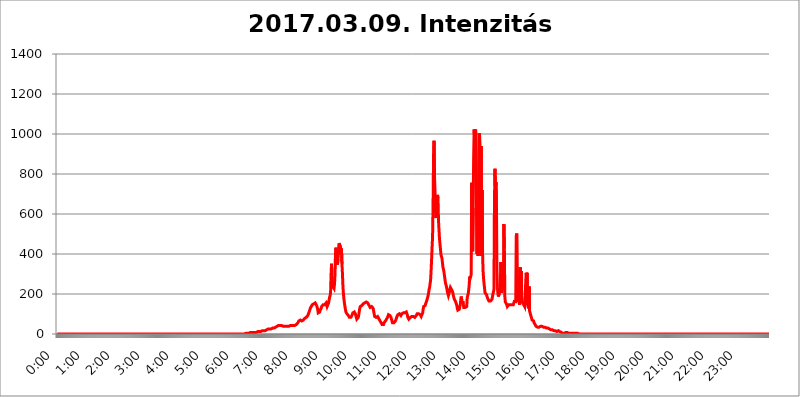
| Category | 2017.03.09. Intenzitás [W/m^2] |
|---|---|
| 0.0 | 0 |
| 0.0006944444444444445 | 0 |
| 0.001388888888888889 | 0 |
| 0.0020833333333333333 | 0 |
| 0.002777777777777778 | 0 |
| 0.003472222222222222 | 0 |
| 0.004166666666666667 | 0 |
| 0.004861111111111111 | 0 |
| 0.005555555555555556 | 0 |
| 0.0062499999999999995 | 0 |
| 0.006944444444444444 | 0 |
| 0.007638888888888889 | 0 |
| 0.008333333333333333 | 0 |
| 0.009027777777777779 | 0 |
| 0.009722222222222222 | 0 |
| 0.010416666666666666 | 0 |
| 0.011111111111111112 | 0 |
| 0.011805555555555555 | 0 |
| 0.012499999999999999 | 0 |
| 0.013194444444444444 | 0 |
| 0.013888888888888888 | 0 |
| 0.014583333333333332 | 0 |
| 0.015277777777777777 | 0 |
| 0.015972222222222224 | 0 |
| 0.016666666666666666 | 0 |
| 0.017361111111111112 | 0 |
| 0.018055555555555557 | 0 |
| 0.01875 | 0 |
| 0.019444444444444445 | 0 |
| 0.02013888888888889 | 0 |
| 0.020833333333333332 | 0 |
| 0.02152777777777778 | 0 |
| 0.022222222222222223 | 0 |
| 0.02291666666666667 | 0 |
| 0.02361111111111111 | 0 |
| 0.024305555555555556 | 0 |
| 0.024999999999999998 | 0 |
| 0.025694444444444447 | 0 |
| 0.02638888888888889 | 0 |
| 0.027083333333333334 | 0 |
| 0.027777777777777776 | 0 |
| 0.02847222222222222 | 0 |
| 0.029166666666666664 | 0 |
| 0.029861111111111113 | 0 |
| 0.030555555555555555 | 0 |
| 0.03125 | 0 |
| 0.03194444444444445 | 0 |
| 0.03263888888888889 | 0 |
| 0.03333333333333333 | 0 |
| 0.034027777777777775 | 0 |
| 0.034722222222222224 | 0 |
| 0.035416666666666666 | 0 |
| 0.036111111111111115 | 0 |
| 0.03680555555555556 | 0 |
| 0.0375 | 0 |
| 0.03819444444444444 | 0 |
| 0.03888888888888889 | 0 |
| 0.03958333333333333 | 0 |
| 0.04027777777777778 | 0 |
| 0.04097222222222222 | 0 |
| 0.041666666666666664 | 0 |
| 0.042361111111111106 | 0 |
| 0.04305555555555556 | 0 |
| 0.043750000000000004 | 0 |
| 0.044444444444444446 | 0 |
| 0.04513888888888889 | 0 |
| 0.04583333333333334 | 0 |
| 0.04652777777777778 | 0 |
| 0.04722222222222222 | 0 |
| 0.04791666666666666 | 0 |
| 0.04861111111111111 | 0 |
| 0.049305555555555554 | 0 |
| 0.049999999999999996 | 0 |
| 0.05069444444444445 | 0 |
| 0.051388888888888894 | 0 |
| 0.052083333333333336 | 0 |
| 0.05277777777777778 | 0 |
| 0.05347222222222222 | 0 |
| 0.05416666666666667 | 0 |
| 0.05486111111111111 | 0 |
| 0.05555555555555555 | 0 |
| 0.05625 | 0 |
| 0.05694444444444444 | 0 |
| 0.057638888888888885 | 0 |
| 0.05833333333333333 | 0 |
| 0.05902777777777778 | 0 |
| 0.059722222222222225 | 0 |
| 0.06041666666666667 | 0 |
| 0.061111111111111116 | 0 |
| 0.06180555555555556 | 0 |
| 0.0625 | 0 |
| 0.06319444444444444 | 0 |
| 0.06388888888888888 | 0 |
| 0.06458333333333334 | 0 |
| 0.06527777777777778 | 0 |
| 0.06597222222222222 | 0 |
| 0.06666666666666667 | 0 |
| 0.06736111111111111 | 0 |
| 0.06805555555555555 | 0 |
| 0.06874999999999999 | 0 |
| 0.06944444444444443 | 0 |
| 0.07013888888888889 | 0 |
| 0.07083333333333333 | 0 |
| 0.07152777777777779 | 0 |
| 0.07222222222222223 | 0 |
| 0.07291666666666667 | 0 |
| 0.07361111111111111 | 0 |
| 0.07430555555555556 | 0 |
| 0.075 | 0 |
| 0.07569444444444444 | 0 |
| 0.0763888888888889 | 0 |
| 0.07708333333333334 | 0 |
| 0.07777777777777778 | 0 |
| 0.07847222222222222 | 0 |
| 0.07916666666666666 | 0 |
| 0.0798611111111111 | 0 |
| 0.08055555555555556 | 0 |
| 0.08125 | 0 |
| 0.08194444444444444 | 0 |
| 0.08263888888888889 | 0 |
| 0.08333333333333333 | 0 |
| 0.08402777777777777 | 0 |
| 0.08472222222222221 | 0 |
| 0.08541666666666665 | 0 |
| 0.08611111111111112 | 0 |
| 0.08680555555555557 | 0 |
| 0.08750000000000001 | 0 |
| 0.08819444444444445 | 0 |
| 0.08888888888888889 | 0 |
| 0.08958333333333333 | 0 |
| 0.09027777777777778 | 0 |
| 0.09097222222222222 | 0 |
| 0.09166666666666667 | 0 |
| 0.09236111111111112 | 0 |
| 0.09305555555555556 | 0 |
| 0.09375 | 0 |
| 0.09444444444444444 | 0 |
| 0.09513888888888888 | 0 |
| 0.09583333333333333 | 0 |
| 0.09652777777777777 | 0 |
| 0.09722222222222222 | 0 |
| 0.09791666666666667 | 0 |
| 0.09861111111111111 | 0 |
| 0.09930555555555555 | 0 |
| 0.09999999999999999 | 0 |
| 0.10069444444444443 | 0 |
| 0.1013888888888889 | 0 |
| 0.10208333333333335 | 0 |
| 0.10277777777777779 | 0 |
| 0.10347222222222223 | 0 |
| 0.10416666666666667 | 0 |
| 0.10486111111111111 | 0 |
| 0.10555555555555556 | 0 |
| 0.10625 | 0 |
| 0.10694444444444444 | 0 |
| 0.1076388888888889 | 0 |
| 0.10833333333333334 | 0 |
| 0.10902777777777778 | 0 |
| 0.10972222222222222 | 0 |
| 0.1111111111111111 | 0 |
| 0.11180555555555556 | 0 |
| 0.11180555555555556 | 0 |
| 0.1125 | 0 |
| 0.11319444444444444 | 0 |
| 0.11388888888888889 | 0 |
| 0.11458333333333333 | 0 |
| 0.11527777777777777 | 0 |
| 0.11597222222222221 | 0 |
| 0.11666666666666665 | 0 |
| 0.1173611111111111 | 0 |
| 0.11805555555555557 | 0 |
| 0.11944444444444445 | 0 |
| 0.12013888888888889 | 0 |
| 0.12083333333333333 | 0 |
| 0.12152777777777778 | 0 |
| 0.12222222222222223 | 0 |
| 0.12291666666666667 | 0 |
| 0.12291666666666667 | 0 |
| 0.12361111111111112 | 0 |
| 0.12430555555555556 | 0 |
| 0.125 | 0 |
| 0.12569444444444444 | 0 |
| 0.12638888888888888 | 0 |
| 0.12708333333333333 | 0 |
| 0.16875 | 0 |
| 0.12847222222222224 | 0 |
| 0.12916666666666668 | 0 |
| 0.12986111111111112 | 0 |
| 0.13055555555555556 | 0 |
| 0.13125 | 0 |
| 0.13194444444444445 | 0 |
| 0.1326388888888889 | 0 |
| 0.13333333333333333 | 0 |
| 0.13402777777777777 | 0 |
| 0.13402777777777777 | 0 |
| 0.13472222222222222 | 0 |
| 0.13541666666666666 | 0 |
| 0.1361111111111111 | 0 |
| 0.13749999999999998 | 0 |
| 0.13819444444444443 | 0 |
| 0.1388888888888889 | 0 |
| 0.13958333333333334 | 0 |
| 0.14027777777777778 | 0 |
| 0.14097222222222222 | 0 |
| 0.14166666666666666 | 0 |
| 0.1423611111111111 | 0 |
| 0.14305555555555557 | 0 |
| 0.14375000000000002 | 0 |
| 0.14444444444444446 | 0 |
| 0.1451388888888889 | 0 |
| 0.1451388888888889 | 0 |
| 0.14652777777777778 | 0 |
| 0.14722222222222223 | 0 |
| 0.14791666666666667 | 0 |
| 0.1486111111111111 | 0 |
| 0.14930555555555555 | 0 |
| 0.15 | 0 |
| 0.15069444444444444 | 0 |
| 0.15138888888888888 | 0 |
| 0.15208333333333332 | 0 |
| 0.15277777777777776 | 0 |
| 0.15347222222222223 | 0 |
| 0.15416666666666667 | 0 |
| 0.15486111111111112 | 0 |
| 0.15555555555555556 | 0 |
| 0.15625 | 0 |
| 0.15694444444444444 | 0 |
| 0.15763888888888888 | 0 |
| 0.15833333333333333 | 0 |
| 0.15902777777777777 | 0 |
| 0.15972222222222224 | 0 |
| 0.16041666666666668 | 0 |
| 0.16111111111111112 | 0 |
| 0.16180555555555556 | 0 |
| 0.1625 | 0 |
| 0.16319444444444445 | 0 |
| 0.1638888888888889 | 0 |
| 0.16458333333333333 | 0 |
| 0.16527777777777777 | 0 |
| 0.16597222222222222 | 0 |
| 0.16666666666666666 | 0 |
| 0.1673611111111111 | 0 |
| 0.16805555555555554 | 0 |
| 0.16874999999999998 | 0 |
| 0.16944444444444443 | 0 |
| 0.17013888888888887 | 0 |
| 0.1708333333333333 | 0 |
| 0.17152777777777775 | 0 |
| 0.17222222222222225 | 0 |
| 0.1729166666666667 | 0 |
| 0.17361111111111113 | 0 |
| 0.17430555555555557 | 0 |
| 0.17500000000000002 | 0 |
| 0.17569444444444446 | 0 |
| 0.1763888888888889 | 0 |
| 0.17708333333333334 | 0 |
| 0.17777777777777778 | 0 |
| 0.17847222222222223 | 0 |
| 0.17916666666666667 | 0 |
| 0.1798611111111111 | 0 |
| 0.18055555555555555 | 0 |
| 0.18125 | 0 |
| 0.18194444444444444 | 0 |
| 0.1826388888888889 | 0 |
| 0.18333333333333335 | 0 |
| 0.1840277777777778 | 0 |
| 0.18472222222222223 | 0 |
| 0.18541666666666667 | 0 |
| 0.18611111111111112 | 0 |
| 0.18680555555555556 | 0 |
| 0.1875 | 0 |
| 0.18819444444444444 | 0 |
| 0.18888888888888888 | 0 |
| 0.18958333333333333 | 0 |
| 0.19027777777777777 | 0 |
| 0.1909722222222222 | 0 |
| 0.19166666666666665 | 0 |
| 0.19236111111111112 | 0 |
| 0.19305555555555554 | 0 |
| 0.19375 | 0 |
| 0.19444444444444445 | 0 |
| 0.1951388888888889 | 0 |
| 0.19583333333333333 | 0 |
| 0.19652777777777777 | 0 |
| 0.19722222222222222 | 0 |
| 0.19791666666666666 | 0 |
| 0.1986111111111111 | 0 |
| 0.19930555555555554 | 0 |
| 0.19999999999999998 | 0 |
| 0.20069444444444443 | 0 |
| 0.20138888888888887 | 0 |
| 0.2020833333333333 | 0 |
| 0.2027777777777778 | 0 |
| 0.2034722222222222 | 0 |
| 0.2041666666666667 | 0 |
| 0.20486111111111113 | 0 |
| 0.20555555555555557 | 0 |
| 0.20625000000000002 | 0 |
| 0.20694444444444446 | 0 |
| 0.2076388888888889 | 0 |
| 0.20833333333333334 | 0 |
| 0.20902777777777778 | 0 |
| 0.20972222222222223 | 0 |
| 0.21041666666666667 | 0 |
| 0.2111111111111111 | 0 |
| 0.21180555555555555 | 0 |
| 0.2125 | 0 |
| 0.21319444444444444 | 0 |
| 0.2138888888888889 | 0 |
| 0.21458333333333335 | 0 |
| 0.2152777777777778 | 0 |
| 0.21597222222222223 | 0 |
| 0.21666666666666667 | 0 |
| 0.21736111111111112 | 0 |
| 0.21805555555555556 | 0 |
| 0.21875 | 0 |
| 0.21944444444444444 | 0 |
| 0.22013888888888888 | 0 |
| 0.22083333333333333 | 0 |
| 0.22152777777777777 | 0 |
| 0.2222222222222222 | 0 |
| 0.22291666666666665 | 0 |
| 0.2236111111111111 | 0 |
| 0.22430555555555556 | 0 |
| 0.225 | 0 |
| 0.22569444444444445 | 0 |
| 0.2263888888888889 | 0 |
| 0.22708333333333333 | 0 |
| 0.22777777777777777 | 0 |
| 0.22847222222222222 | 0 |
| 0.22916666666666666 | 0 |
| 0.2298611111111111 | 0 |
| 0.23055555555555554 | 0 |
| 0.23124999999999998 | 0 |
| 0.23194444444444443 | 0 |
| 0.23263888888888887 | 0 |
| 0.2333333333333333 | 0 |
| 0.2340277777777778 | 0 |
| 0.2347222222222222 | 0 |
| 0.2354166666666667 | 0 |
| 0.23611111111111113 | 0 |
| 0.23680555555555557 | 0 |
| 0.23750000000000002 | 0 |
| 0.23819444444444446 | 0 |
| 0.2388888888888889 | 0 |
| 0.23958333333333334 | 0 |
| 0.24027777777777778 | 0 |
| 0.24097222222222223 | 0 |
| 0.24166666666666667 | 0 |
| 0.2423611111111111 | 0 |
| 0.24305555555555555 | 0 |
| 0.24375 | 0 |
| 0.24444444444444446 | 0 |
| 0.24513888888888888 | 0 |
| 0.24583333333333335 | 0 |
| 0.2465277777777778 | 0 |
| 0.24722222222222223 | 0 |
| 0.24791666666666667 | 0 |
| 0.24861111111111112 | 0 |
| 0.24930555555555556 | 0 |
| 0.25 | 0 |
| 0.25069444444444444 | 0 |
| 0.2513888888888889 | 0 |
| 0.2520833333333333 | 0 |
| 0.25277777777777777 | 0 |
| 0.2534722222222222 | 0 |
| 0.25416666666666665 | 0 |
| 0.2548611111111111 | 0 |
| 0.2555555555555556 | 0 |
| 0.25625000000000003 | 0 |
| 0.2569444444444445 | 0 |
| 0.2576388888888889 | 0 |
| 0.25833333333333336 | 0 |
| 0.2590277777777778 | 0 |
| 0.25972222222222224 | 0 |
| 0.2604166666666667 | 0 |
| 0.2611111111111111 | 0 |
| 0.26180555555555557 | 0 |
| 0.2625 | 0 |
| 0.26319444444444445 | 0 |
| 0.2638888888888889 | 0 |
| 0.26458333333333334 | 3.525 |
| 0.2652777777777778 | 3.525 |
| 0.2659722222222222 | 3.525 |
| 0.26666666666666666 | 3.525 |
| 0.2673611111111111 | 3.525 |
| 0.26805555555555555 | 3.525 |
| 0.26875 | 3.525 |
| 0.26944444444444443 | 3.525 |
| 0.2701388888888889 | 3.525 |
| 0.2708333333333333 | 7.887 |
| 0.27152777777777776 | 3.525 |
| 0.2722222222222222 | 7.887 |
| 0.27291666666666664 | 7.887 |
| 0.2736111111111111 | 7.887 |
| 0.2743055555555555 | 7.887 |
| 0.27499999999999997 | 7.887 |
| 0.27569444444444446 | 7.887 |
| 0.27638888888888885 | 7.887 |
| 0.27708333333333335 | 7.887 |
| 0.2777777777777778 | 7.887 |
| 0.27847222222222223 | 7.887 |
| 0.2791666666666667 | 7.887 |
| 0.2798611111111111 | 7.887 |
| 0.28055555555555556 | 12.257 |
| 0.28125 | 12.257 |
| 0.28194444444444444 | 12.257 |
| 0.2826388888888889 | 12.257 |
| 0.2833333333333333 | 12.257 |
| 0.28402777777777777 | 12.257 |
| 0.2847222222222222 | 12.257 |
| 0.28541666666666665 | 12.257 |
| 0.28611111111111115 | 16.636 |
| 0.28680555555555554 | 16.636 |
| 0.28750000000000003 | 16.636 |
| 0.2881944444444445 | 16.636 |
| 0.2888888888888889 | 16.636 |
| 0.28958333333333336 | 16.636 |
| 0.2902777777777778 | 16.636 |
| 0.29097222222222224 | 16.636 |
| 0.2916666666666667 | 16.636 |
| 0.2923611111111111 | 16.636 |
| 0.29305555555555557 | 21.024 |
| 0.29375 | 21.024 |
| 0.29444444444444445 | 21.024 |
| 0.2951388888888889 | 21.024 |
| 0.29583333333333334 | 25.419 |
| 0.2965277777777778 | 25.419 |
| 0.2972222222222222 | 25.419 |
| 0.29791666666666666 | 25.419 |
| 0.2986111111111111 | 25.419 |
| 0.29930555555555555 | 25.419 |
| 0.3 | 25.419 |
| 0.30069444444444443 | 29.823 |
| 0.3013888888888889 | 29.823 |
| 0.3020833333333333 | 29.823 |
| 0.30277777777777776 | 29.823 |
| 0.3034722222222222 | 29.823 |
| 0.30416666666666664 | 29.823 |
| 0.3048611111111111 | 29.823 |
| 0.3055555555555555 | 29.823 |
| 0.30624999999999997 | 34.234 |
| 0.3069444444444444 | 34.234 |
| 0.3076388888888889 | 38.653 |
| 0.30833333333333335 | 38.653 |
| 0.3090277777777778 | 38.653 |
| 0.30972222222222223 | 43.079 |
| 0.3104166666666667 | 43.079 |
| 0.3111111111111111 | 43.079 |
| 0.31180555555555556 | 43.079 |
| 0.3125 | 43.079 |
| 0.31319444444444444 | 43.079 |
| 0.3138888888888889 | 43.079 |
| 0.3145833333333333 | 43.079 |
| 0.31527777777777777 | 38.653 |
| 0.3159722222222222 | 38.653 |
| 0.31666666666666665 | 38.653 |
| 0.31736111111111115 | 38.653 |
| 0.31805555555555554 | 38.653 |
| 0.31875000000000003 | 38.653 |
| 0.3194444444444445 | 38.653 |
| 0.3201388888888889 | 38.653 |
| 0.32083333333333336 | 38.653 |
| 0.3215277777777778 | 38.653 |
| 0.32222222222222224 | 38.653 |
| 0.3229166666666667 | 38.653 |
| 0.3236111111111111 | 38.653 |
| 0.32430555555555557 | 38.653 |
| 0.325 | 38.653 |
| 0.32569444444444445 | 38.653 |
| 0.3263888888888889 | 38.653 |
| 0.32708333333333334 | 43.079 |
| 0.3277777777777778 | 43.079 |
| 0.3284722222222222 | 43.079 |
| 0.32916666666666666 | 43.079 |
| 0.3298611111111111 | 43.079 |
| 0.33055555555555555 | 43.079 |
| 0.33125 | 43.079 |
| 0.33194444444444443 | 43.079 |
| 0.3326388888888889 | 43.079 |
| 0.3333333333333333 | 43.079 |
| 0.3340277777777778 | 43.079 |
| 0.3347222222222222 | 47.511 |
| 0.3354166666666667 | 47.511 |
| 0.3361111111111111 | 47.511 |
| 0.3368055555555556 | 51.951 |
| 0.33749999999999997 | 56.398 |
| 0.33819444444444446 | 56.398 |
| 0.33888888888888885 | 65.31 |
| 0.33958333333333335 | 65.31 |
| 0.34027777777777773 | 69.775 |
| 0.34097222222222223 | 69.775 |
| 0.3416666666666666 | 69.775 |
| 0.3423611111111111 | 69.775 |
| 0.3430555555555555 | 65.31 |
| 0.34375 | 65.31 |
| 0.3444444444444445 | 65.31 |
| 0.3451388888888889 | 69.775 |
| 0.3458333333333334 | 74.246 |
| 0.34652777777777777 | 74.246 |
| 0.34722222222222227 | 78.722 |
| 0.34791666666666665 | 78.722 |
| 0.34861111111111115 | 83.205 |
| 0.34930555555555554 | 83.205 |
| 0.35000000000000003 | 83.205 |
| 0.3506944444444444 | 87.692 |
| 0.3513888888888889 | 92.184 |
| 0.3520833333333333 | 96.682 |
| 0.3527777777777778 | 105.69 |
| 0.3534722222222222 | 110.201 |
| 0.3541666666666667 | 119.235 |
| 0.3548611111111111 | 128.284 |
| 0.35555555555555557 | 132.814 |
| 0.35625 | 137.347 |
| 0.35694444444444445 | 141.884 |
| 0.3576388888888889 | 146.423 |
| 0.35833333333333334 | 146.423 |
| 0.3590277777777778 | 150.964 |
| 0.3597222222222222 | 150.964 |
| 0.36041666666666666 | 155.509 |
| 0.3611111111111111 | 155.509 |
| 0.36180555555555555 | 155.509 |
| 0.3625 | 155.509 |
| 0.36319444444444443 | 150.964 |
| 0.3638888888888889 | 141.884 |
| 0.3645833333333333 | 132.814 |
| 0.3652777777777778 | 123.758 |
| 0.3659722222222222 | 105.69 |
| 0.3666666666666667 | 101.184 |
| 0.3673611111111111 | 105.69 |
| 0.3680555555555556 | 110.201 |
| 0.36874999999999997 | 119.235 |
| 0.36944444444444446 | 123.758 |
| 0.37013888888888885 | 128.284 |
| 0.37083333333333335 | 137.347 |
| 0.37152777777777773 | 137.347 |
| 0.37222222222222223 | 141.884 |
| 0.3729166666666666 | 146.423 |
| 0.3736111111111111 | 146.423 |
| 0.3743055555555555 | 146.423 |
| 0.375 | 146.423 |
| 0.3756944444444445 | 146.423 |
| 0.3763888888888889 | 150.964 |
| 0.3770833333333334 | 155.509 |
| 0.37777777777777777 | 146.423 |
| 0.37847222222222227 | 137.347 |
| 0.37916666666666665 | 132.814 |
| 0.37986111111111115 | 137.347 |
| 0.38055555555555554 | 155.509 |
| 0.38125000000000003 | 169.156 |
| 0.3819444444444444 | 182.82 |
| 0.3826388888888889 | 191.937 |
| 0.3833333333333333 | 205.62 |
| 0.3840277777777778 | 296.808 |
| 0.3847222222222222 | 351.198 |
| 0.3854166666666667 | 246.689 |
| 0.3861111111111111 | 228.436 |
| 0.38680555555555557 | 237.564 |
| 0.3875 | 242.127 |
| 0.38819444444444445 | 228.436 |
| 0.3888888888888889 | 251.251 |
| 0.38958333333333334 | 301.354 |
| 0.3902777777777778 | 405.108 |
| 0.3909722222222222 | 431.833 |
| 0.39166666666666666 | 369.23 |
| 0.3923611111111111 | 364.728 |
| 0.39305555555555555 | 346.682 |
| 0.39375 | 373.729 |
| 0.39444444444444443 | 400.638 |
| 0.3951388888888889 | 453.968 |
| 0.3958333333333333 | 449.551 |
| 0.3965277777777778 | 449.551 |
| 0.3972222222222222 | 436.27 |
| 0.3979166666666667 | 405.108 |
| 0.3986111111111111 | 427.39 |
| 0.3993055555555556 | 351.198 |
| 0.39999999999999997 | 301.354 |
| 0.40069444444444446 | 237.564 |
| 0.40138888888888885 | 201.058 |
| 0.40208333333333335 | 173.709 |
| 0.40277777777777773 | 155.509 |
| 0.40347222222222223 | 137.347 |
| 0.4041666666666666 | 123.758 |
| 0.4048611111111111 | 110.201 |
| 0.4055555555555555 | 105.69 |
| 0.40625 | 101.184 |
| 0.4069444444444445 | 96.682 |
| 0.4076388888888889 | 96.682 |
| 0.4083333333333334 | 92.184 |
| 0.40902777777777777 | 87.692 |
| 0.40972222222222227 | 83.205 |
| 0.41041666666666665 | 83.205 |
| 0.41111111111111115 | 78.722 |
| 0.41180555555555554 | 83.205 |
| 0.41250000000000003 | 83.205 |
| 0.4131944444444444 | 92.184 |
| 0.4138888888888889 | 96.682 |
| 0.4145833333333333 | 105.69 |
| 0.4152777777777778 | 110.201 |
| 0.4159722222222222 | 110.201 |
| 0.4166666666666667 | 110.201 |
| 0.4173611111111111 | 110.201 |
| 0.41805555555555557 | 101.184 |
| 0.41875 | 92.184 |
| 0.41944444444444445 | 83.205 |
| 0.4201388888888889 | 74.246 |
| 0.42083333333333334 | 69.775 |
| 0.4215277777777778 | 74.246 |
| 0.4222222222222222 | 83.205 |
| 0.42291666666666666 | 96.682 |
| 0.4236111111111111 | 114.716 |
| 0.42430555555555555 | 128.284 |
| 0.425 | 137.347 |
| 0.42569444444444443 | 141.884 |
| 0.4263888888888889 | 141.884 |
| 0.4270833333333333 | 141.884 |
| 0.4277777777777778 | 141.884 |
| 0.4284722222222222 | 146.423 |
| 0.4291666666666667 | 150.964 |
| 0.4298611111111111 | 155.509 |
| 0.4305555555555556 | 155.509 |
| 0.43124999999999997 | 155.509 |
| 0.43194444444444446 | 155.509 |
| 0.43263888888888885 | 160.056 |
| 0.43333333333333335 | 160.056 |
| 0.43402777777777773 | 155.509 |
| 0.43472222222222223 | 155.509 |
| 0.4354166666666666 | 155.509 |
| 0.4361111111111111 | 155.509 |
| 0.4368055555555555 | 150.964 |
| 0.4375 | 141.884 |
| 0.4381944444444445 | 137.347 |
| 0.4388888888888889 | 132.814 |
| 0.4395833333333334 | 132.814 |
| 0.44027777777777777 | 137.347 |
| 0.44097222222222227 | 137.347 |
| 0.44166666666666665 | 141.884 |
| 0.44236111111111115 | 137.347 |
| 0.44305555555555554 | 128.284 |
| 0.44375000000000003 | 114.716 |
| 0.4444444444444444 | 101.184 |
| 0.4451388888888889 | 87.692 |
| 0.4458333333333333 | 83.205 |
| 0.4465277777777778 | 83.205 |
| 0.4472222222222222 | 83.205 |
| 0.4479166666666667 | 83.205 |
| 0.4486111111111111 | 87.692 |
| 0.44930555555555557 | 87.692 |
| 0.45 | 87.692 |
| 0.45069444444444445 | 83.205 |
| 0.4513888888888889 | 74.246 |
| 0.45208333333333334 | 69.775 |
| 0.4527777777777778 | 65.31 |
| 0.4534722222222222 | 60.85 |
| 0.45416666666666666 | 56.398 |
| 0.4548611111111111 | 51.951 |
| 0.45555555555555555 | 47.511 |
| 0.45625 | 47.511 |
| 0.45694444444444443 | 47.511 |
| 0.4576388888888889 | 47.511 |
| 0.4583333333333333 | 56.398 |
| 0.4590277777777778 | 56.398 |
| 0.4597222222222222 | 60.85 |
| 0.4604166666666667 | 65.31 |
| 0.4611111111111111 | 69.775 |
| 0.4618055555555556 | 74.246 |
| 0.46249999999999997 | 74.246 |
| 0.46319444444444446 | 83.205 |
| 0.46388888888888885 | 87.692 |
| 0.46458333333333335 | 96.682 |
| 0.46527777777777773 | 96.682 |
| 0.46597222222222223 | 96.682 |
| 0.4666666666666666 | 92.184 |
| 0.4673611111111111 | 87.692 |
| 0.4680555555555555 | 83.205 |
| 0.46875 | 74.246 |
| 0.4694444444444445 | 65.31 |
| 0.4701388888888889 | 56.398 |
| 0.4708333333333334 | 56.398 |
| 0.47152777777777777 | 56.398 |
| 0.47222222222222227 | 56.398 |
| 0.47291666666666665 | 56.398 |
| 0.47361111111111115 | 60.85 |
| 0.47430555555555554 | 65.31 |
| 0.47500000000000003 | 69.775 |
| 0.4756944444444444 | 78.722 |
| 0.4763888888888889 | 87.692 |
| 0.4770833333333333 | 92.184 |
| 0.4777777777777778 | 96.682 |
| 0.4784722222222222 | 101.184 |
| 0.4791666666666667 | 101.184 |
| 0.4798611111111111 | 101.184 |
| 0.48055555555555557 | 101.184 |
| 0.48125 | 96.682 |
| 0.48194444444444445 | 92.184 |
| 0.4826388888888889 | 96.682 |
| 0.48333333333333334 | 101.184 |
| 0.4840277777777778 | 105.69 |
| 0.4847222222222222 | 105.69 |
| 0.48541666666666666 | 105.69 |
| 0.4861111111111111 | 105.69 |
| 0.48680555555555555 | 105.69 |
| 0.4875 | 105.69 |
| 0.48819444444444443 | 105.69 |
| 0.4888888888888889 | 105.69 |
| 0.4895833333333333 | 110.201 |
| 0.4902777777777778 | 105.69 |
| 0.4909722222222222 | 96.682 |
| 0.4916666666666667 | 83.205 |
| 0.4923611111111111 | 78.722 |
| 0.4930555555555556 | 74.246 |
| 0.49374999999999997 | 74.246 |
| 0.49444444444444446 | 78.722 |
| 0.49513888888888885 | 83.205 |
| 0.49583333333333335 | 83.205 |
| 0.49652777777777773 | 87.692 |
| 0.49722222222222223 | 87.692 |
| 0.4979166666666666 | 92.184 |
| 0.4986111111111111 | 92.184 |
| 0.4993055555555555 | 87.692 |
| 0.5 | 87.692 |
| 0.5006944444444444 | 83.205 |
| 0.5013888888888889 | 83.205 |
| 0.5020833333333333 | 87.692 |
| 0.5027777777777778 | 87.692 |
| 0.5034722222222222 | 92.184 |
| 0.5041666666666667 | 96.682 |
| 0.5048611111111111 | 101.184 |
| 0.5055555555555555 | 105.69 |
| 0.50625 | 101.184 |
| 0.5069444444444444 | 101.184 |
| 0.5076388888888889 | 96.682 |
| 0.5083333333333333 | 96.682 |
| 0.5090277777777777 | 96.682 |
| 0.5097222222222222 | 92.184 |
| 0.5104166666666666 | 87.692 |
| 0.5111111111111112 | 87.692 |
| 0.5118055555555555 | 92.184 |
| 0.5125000000000001 | 105.69 |
| 0.5131944444444444 | 123.758 |
| 0.513888888888889 | 137.347 |
| 0.5145833333333333 | 141.884 |
| 0.5152777777777778 | 141.884 |
| 0.5159722222222222 | 141.884 |
| 0.5166666666666667 | 150.964 |
| 0.517361111111111 | 155.509 |
| 0.5180555555555556 | 164.605 |
| 0.5187499999999999 | 173.709 |
| 0.5194444444444445 | 182.82 |
| 0.5201388888888888 | 191.937 |
| 0.5208333333333334 | 205.62 |
| 0.5215277777777778 | 223.873 |
| 0.5222222222222223 | 233 |
| 0.5229166666666667 | 251.251 |
| 0.5236111111111111 | 269.49 |
| 0.5243055555555556 | 314.98 |
| 0.525 | 369.23 |
| 0.5256944444444445 | 431.833 |
| 0.5263888888888889 | 484.735 |
| 0.5270833333333333 | 642.4 |
| 0.5277777777777778 | 891.099 |
| 0.5284722222222222 | 966.295 |
| 0.5291666666666667 | 783.342 |
| 0.5298611111111111 | 711.832 |
| 0.5305555555555556 | 609.062 |
| 0.53125 | 579.542 |
| 0.5319444444444444 | 646.537 |
| 0.5326388888888889 | 663.019 |
| 0.5333333333333333 | 695.666 |
| 0.5340277777777778 | 679.395 |
| 0.5347222222222222 | 566.793 |
| 0.5354166666666667 | 519.555 |
| 0.5361111111111111 | 475.972 |
| 0.5368055555555555 | 449.551 |
| 0.5375 | 422.943 |
| 0.5381944444444444 | 396.164 |
| 0.5388888888888889 | 400.638 |
| 0.5395833333333333 | 378.224 |
| 0.5402777777777777 | 355.712 |
| 0.5409722222222222 | 333.113 |
| 0.5416666666666666 | 324.052 |
| 0.5423611111111112 | 310.44 |
| 0.5430555555555555 | 292.259 |
| 0.5437500000000001 | 274.047 |
| 0.5444444444444444 | 255.813 |
| 0.545138888888889 | 246.689 |
| 0.5458333333333333 | 237.564 |
| 0.5465277777777778 | 223.873 |
| 0.5472222222222222 | 210.182 |
| 0.5479166666666667 | 201.058 |
| 0.548611111111111 | 191.937 |
| 0.5493055555555556 | 191.937 |
| 0.5499999999999999 | 210.182 |
| 0.5506944444444445 | 223.873 |
| 0.5513888888888888 | 233 |
| 0.5520833333333334 | 233 |
| 0.5527777777777778 | 223.873 |
| 0.5534722222222223 | 219.309 |
| 0.5541666666666667 | 214.746 |
| 0.5548611111111111 | 205.62 |
| 0.5555555555555556 | 191.937 |
| 0.55625 | 182.82 |
| 0.5569444444444445 | 173.709 |
| 0.5576388888888889 | 169.156 |
| 0.5583333333333333 | 164.605 |
| 0.5590277777777778 | 160.056 |
| 0.5597222222222222 | 150.964 |
| 0.5604166666666667 | 141.884 |
| 0.5611111111111111 | 128.284 |
| 0.5618055555555556 | 119.235 |
| 0.5625 | 119.235 |
| 0.5631944444444444 | 119.235 |
| 0.5638888888888889 | 123.758 |
| 0.5645833333333333 | 137.347 |
| 0.5652777777777778 | 146.423 |
| 0.5659722222222222 | 173.709 |
| 0.5666666666666667 | 187.378 |
| 0.5673611111111111 | 169.156 |
| 0.5680555555555555 | 155.509 |
| 0.56875 | 164.605 |
| 0.5694444444444444 | 150.964 |
| 0.5701388888888889 | 132.814 |
| 0.5708333333333333 | 128.284 |
| 0.5715277777777777 | 128.284 |
| 0.5722222222222222 | 132.814 |
| 0.5729166666666666 | 128.284 |
| 0.5736111111111112 | 128.284 |
| 0.5743055555555555 | 137.347 |
| 0.5750000000000001 | 182.82 |
| 0.5756944444444444 | 191.937 |
| 0.576388888888889 | 201.058 |
| 0.5770833333333333 | 219.309 |
| 0.5777777777777778 | 246.689 |
| 0.5784722222222222 | 287.709 |
| 0.5791666666666667 | 278.603 |
| 0.579861111111111 | 274.047 |
| 0.5805555555555556 | 296.808 |
| 0.5812499999999999 | 755.766 |
| 0.5819444444444445 | 759.723 |
| 0.5826388888888888 | 414.035 |
| 0.5833333333333334 | 629.948 |
| 0.5840277777777778 | 883.516 |
| 0.5847222222222223 | 1022.323 |
| 0.5854166666666667 | 977.508 |
| 0.5861111111111111 | 1003.65 |
| 0.5868055555555556 | 1022.323 |
| 0.5875 | 1026.06 |
| 0.5881944444444445 | 1026.06 |
| 0.5888888888888889 | 400.638 |
| 0.5895833333333333 | 667.123 |
| 0.5902777777777778 | 391.685 |
| 0.5909722222222222 | 536.82 |
| 0.5916666666666667 | 1003.65 |
| 0.5923611111111111 | 992.448 |
| 0.5930555555555556 | 932.576 |
| 0.59375 | 566.793 |
| 0.5944444444444444 | 940.082 |
| 0.5951388888888889 | 391.685 |
| 0.5958333333333333 | 719.877 |
| 0.5965277777777778 | 405.108 |
| 0.5972222222222222 | 314.98 |
| 0.5979166666666667 | 278.603 |
| 0.5986111111111111 | 251.251 |
| 0.5993055555555555 | 228.436 |
| 0.6 | 205.62 |
| 0.6006944444444444 | 201.058 |
| 0.6013888888888889 | 201.058 |
| 0.6020833333333333 | 196.497 |
| 0.6027777777777777 | 187.378 |
| 0.6034722222222222 | 182.82 |
| 0.6041666666666666 | 173.709 |
| 0.6048611111111112 | 169.156 |
| 0.6055555555555555 | 164.605 |
| 0.6062500000000001 | 164.605 |
| 0.6069444444444444 | 160.056 |
| 0.607638888888889 | 164.605 |
| 0.6083333333333333 | 169.156 |
| 0.6090277777777778 | 169.156 |
| 0.6097222222222222 | 173.709 |
| 0.6104166666666667 | 187.378 |
| 0.611111111111111 | 201.058 |
| 0.6118055555555556 | 210.182 |
| 0.6124999999999999 | 223.873 |
| 0.6131944444444445 | 663.019 |
| 0.6138888888888888 | 826.123 |
| 0.6145833333333334 | 727.896 |
| 0.6152777777777778 | 759.723 |
| 0.6159722222222223 | 667.123 |
| 0.6166666666666667 | 319.517 |
| 0.6173611111111111 | 233 |
| 0.6180555555555556 | 201.058 |
| 0.61875 | 187.378 |
| 0.6194444444444445 | 191.937 |
| 0.6201388888888889 | 205.62 |
| 0.6208333333333333 | 210.182 |
| 0.6215277777777778 | 251.251 |
| 0.6222222222222222 | 360.221 |
| 0.6229166666666667 | 205.62 |
| 0.6236111111111111 | 214.746 |
| 0.6243055555555556 | 214.746 |
| 0.625 | 228.436 |
| 0.6256944444444444 | 237.564 |
| 0.6263888888888889 | 549.704 |
| 0.6270833333333333 | 427.39 |
| 0.6277777777777778 | 187.378 |
| 0.6284722222222222 | 160.056 |
| 0.6291666666666667 | 155.509 |
| 0.6298611111111111 | 155.509 |
| 0.6305555555555555 | 146.423 |
| 0.63125 | 137.347 |
| 0.6319444444444444 | 137.347 |
| 0.6326388888888889 | 141.884 |
| 0.6333333333333333 | 146.423 |
| 0.6340277777777777 | 150.964 |
| 0.6347222222222222 | 146.423 |
| 0.6354166666666666 | 146.423 |
| 0.6361111111111112 | 146.423 |
| 0.6368055555555555 | 146.423 |
| 0.6375000000000001 | 146.423 |
| 0.6381944444444444 | 141.884 |
| 0.638888888888889 | 141.884 |
| 0.6395833333333333 | 146.423 |
| 0.6402777777777778 | 146.423 |
| 0.6409722222222222 | 150.964 |
| 0.6416666666666667 | 169.156 |
| 0.642361111111111 | 155.509 |
| 0.6430555555555556 | 164.605 |
| 0.6437499999999999 | 489.108 |
| 0.6444444444444445 | 502.192 |
| 0.6451388888888888 | 187.378 |
| 0.6458333333333334 | 160.056 |
| 0.6465277777777778 | 178.264 |
| 0.6472222222222223 | 287.709 |
| 0.6479166666666667 | 155.509 |
| 0.6486111111111111 | 146.423 |
| 0.6493055555555556 | 333.113 |
| 0.65 | 182.82 |
| 0.6506944444444445 | 314.98 |
| 0.6513888888888889 | 160.056 |
| 0.6520833333333333 | 164.605 |
| 0.6527777777777778 | 155.509 |
| 0.6534722222222222 | 155.509 |
| 0.6541666666666667 | 146.423 |
| 0.6548611111111111 | 146.423 |
| 0.6555555555555556 | 137.347 |
| 0.65625 | 141.884 |
| 0.6569444444444444 | 137.347 |
| 0.6576388888888889 | 305.898 |
| 0.6583333333333333 | 296.808 |
| 0.6590277777777778 | 305.898 |
| 0.6597222222222222 | 146.423 |
| 0.6604166666666667 | 137.347 |
| 0.6611111111111111 | 128.284 |
| 0.6618055555555555 | 237.564 |
| 0.6625 | 114.716 |
| 0.6631944444444444 | 105.69 |
| 0.6638888888888889 | 96.682 |
| 0.6645833333333333 | 87.692 |
| 0.6652777777777777 | 78.722 |
| 0.6659722222222222 | 69.775 |
| 0.6666666666666666 | 65.31 |
| 0.6673611111111111 | 65.31 |
| 0.6680555555555556 | 65.31 |
| 0.6687500000000001 | 56.398 |
| 0.6694444444444444 | 51.951 |
| 0.6701388888888888 | 47.511 |
| 0.6708333333333334 | 43.079 |
| 0.6715277777777778 | 38.653 |
| 0.6722222222222222 | 38.653 |
| 0.6729166666666666 | 34.234 |
| 0.6736111111111112 | 34.234 |
| 0.6743055555555556 | 34.234 |
| 0.6749999999999999 | 34.234 |
| 0.6756944444444444 | 34.234 |
| 0.6763888888888889 | 34.234 |
| 0.6770833333333334 | 34.234 |
| 0.6777777777777777 | 38.653 |
| 0.6784722222222223 | 38.653 |
| 0.6791666666666667 | 38.653 |
| 0.6798611111111111 | 38.653 |
| 0.6805555555555555 | 38.653 |
| 0.68125 | 38.653 |
| 0.6819444444444445 | 34.234 |
| 0.6826388888888889 | 34.234 |
| 0.6833333333333332 | 34.234 |
| 0.6840277777777778 | 34.234 |
| 0.6847222222222222 | 34.234 |
| 0.6854166666666667 | 29.823 |
| 0.686111111111111 | 29.823 |
| 0.6868055555555556 | 29.823 |
| 0.6875 | 29.823 |
| 0.6881944444444444 | 29.823 |
| 0.688888888888889 | 25.419 |
| 0.6895833333333333 | 25.419 |
| 0.6902777777777778 | 25.419 |
| 0.6909722222222222 | 21.024 |
| 0.6916666666666668 | 21.024 |
| 0.6923611111111111 | 21.024 |
| 0.6930555555555555 | 21.024 |
| 0.69375 | 21.024 |
| 0.6944444444444445 | 21.024 |
| 0.6951388888888889 | 16.636 |
| 0.6958333333333333 | 16.636 |
| 0.6965277777777777 | 16.636 |
| 0.6972222222222223 | 16.636 |
| 0.6979166666666666 | 16.636 |
| 0.6986111111111111 | 16.636 |
| 0.6993055555555556 | 16.636 |
| 0.7000000000000001 | 12.257 |
| 0.7006944444444444 | 12.257 |
| 0.7013888888888888 | 12.257 |
| 0.7020833333333334 | 12.257 |
| 0.7027777777777778 | 16.636 |
| 0.7034722222222222 | 16.636 |
| 0.7041666666666666 | 16.636 |
| 0.7048611111111112 | 12.257 |
| 0.7055555555555556 | 7.887 |
| 0.7062499999999999 | 7.887 |
| 0.7069444444444444 | 7.887 |
| 0.7076388888888889 | 7.887 |
| 0.7083333333333334 | 3.525 |
| 0.7090277777777777 | 3.525 |
| 0.7097222222222223 | 3.525 |
| 0.7104166666666667 | 3.525 |
| 0.7111111111111111 | 3.525 |
| 0.7118055555555555 | 7.887 |
| 0.7125 | 7.887 |
| 0.7131944444444445 | 7.887 |
| 0.7138888888888889 | 7.887 |
| 0.7145833333333332 | 7.887 |
| 0.7152777777777778 | 7.887 |
| 0.7159722222222222 | 7.887 |
| 0.7166666666666667 | 3.525 |
| 0.717361111111111 | 3.525 |
| 0.7180555555555556 | 3.525 |
| 0.71875 | 7.887 |
| 0.7194444444444444 | 3.525 |
| 0.720138888888889 | 3.525 |
| 0.7208333333333333 | 3.525 |
| 0.7215277777777778 | 3.525 |
| 0.7222222222222222 | 3.525 |
| 0.7229166666666668 | 3.525 |
| 0.7236111111111111 | 3.525 |
| 0.7243055555555555 | 3.525 |
| 0.725 | 3.525 |
| 0.7256944444444445 | 3.525 |
| 0.7263888888888889 | 3.525 |
| 0.7270833333333333 | 3.525 |
| 0.7277777777777777 | 3.525 |
| 0.7284722222222223 | 3.525 |
| 0.7291666666666666 | 3.525 |
| 0.7298611111111111 | 3.525 |
| 0.7305555555555556 | 3.525 |
| 0.7312500000000001 | 0 |
| 0.7319444444444444 | 0 |
| 0.7326388888888888 | 0 |
| 0.7333333333333334 | 0 |
| 0.7340277777777778 | 0 |
| 0.7347222222222222 | 0 |
| 0.7354166666666666 | 0 |
| 0.7361111111111112 | 0 |
| 0.7368055555555556 | 0 |
| 0.7374999999999999 | 0 |
| 0.7381944444444444 | 0 |
| 0.7388888888888889 | 0 |
| 0.7395833333333334 | 0 |
| 0.7402777777777777 | 0 |
| 0.7409722222222223 | 0 |
| 0.7416666666666667 | 0 |
| 0.7423611111111111 | 0 |
| 0.7430555555555555 | 0 |
| 0.74375 | 0 |
| 0.7444444444444445 | 0 |
| 0.7451388888888889 | 0 |
| 0.7458333333333332 | 0 |
| 0.7465277777777778 | 0 |
| 0.7472222222222222 | 0 |
| 0.7479166666666667 | 0 |
| 0.748611111111111 | 0 |
| 0.7493055555555556 | 0 |
| 0.75 | 0 |
| 0.7506944444444444 | 0 |
| 0.751388888888889 | 0 |
| 0.7520833333333333 | 0 |
| 0.7527777777777778 | 0 |
| 0.7534722222222222 | 0 |
| 0.7541666666666668 | 0 |
| 0.7548611111111111 | 0 |
| 0.7555555555555555 | 0 |
| 0.75625 | 0 |
| 0.7569444444444445 | 0 |
| 0.7576388888888889 | 0 |
| 0.7583333333333333 | 0 |
| 0.7590277777777777 | 0 |
| 0.7597222222222223 | 0 |
| 0.7604166666666666 | 0 |
| 0.7611111111111111 | 0 |
| 0.7618055555555556 | 0 |
| 0.7625000000000001 | 0 |
| 0.7631944444444444 | 0 |
| 0.7638888888888888 | 0 |
| 0.7645833333333334 | 0 |
| 0.7652777777777778 | 0 |
| 0.7659722222222222 | 0 |
| 0.7666666666666666 | 0 |
| 0.7673611111111112 | 0 |
| 0.7680555555555556 | 0 |
| 0.7687499999999999 | 0 |
| 0.7694444444444444 | 0 |
| 0.7701388888888889 | 0 |
| 0.7708333333333334 | 0 |
| 0.7715277777777777 | 0 |
| 0.7722222222222223 | 0 |
| 0.7729166666666667 | 0 |
| 0.7736111111111111 | 0 |
| 0.7743055555555555 | 0 |
| 0.775 | 0 |
| 0.7756944444444445 | 0 |
| 0.7763888888888889 | 0 |
| 0.7770833333333332 | 0 |
| 0.7777777777777778 | 0 |
| 0.7784722222222222 | 0 |
| 0.7791666666666667 | 0 |
| 0.779861111111111 | 0 |
| 0.7805555555555556 | 0 |
| 0.78125 | 0 |
| 0.7819444444444444 | 0 |
| 0.782638888888889 | 0 |
| 0.7833333333333333 | 0 |
| 0.7840277777777778 | 0 |
| 0.7847222222222222 | 0 |
| 0.7854166666666668 | 0 |
| 0.7861111111111111 | 0 |
| 0.7868055555555555 | 0 |
| 0.7875 | 0 |
| 0.7881944444444445 | 0 |
| 0.7888888888888889 | 0 |
| 0.7895833333333333 | 0 |
| 0.7902777777777777 | 0 |
| 0.7909722222222223 | 0 |
| 0.7916666666666666 | 0 |
| 0.7923611111111111 | 0 |
| 0.7930555555555556 | 0 |
| 0.7937500000000001 | 0 |
| 0.7944444444444444 | 0 |
| 0.7951388888888888 | 0 |
| 0.7958333333333334 | 0 |
| 0.7965277777777778 | 0 |
| 0.7972222222222222 | 0 |
| 0.7979166666666666 | 0 |
| 0.7986111111111112 | 0 |
| 0.7993055555555556 | 0 |
| 0.7999999999999999 | 0 |
| 0.8006944444444444 | 0 |
| 0.8013888888888889 | 0 |
| 0.8020833333333334 | 0 |
| 0.8027777777777777 | 0 |
| 0.8034722222222223 | 0 |
| 0.8041666666666667 | 0 |
| 0.8048611111111111 | 0 |
| 0.8055555555555555 | 0 |
| 0.80625 | 0 |
| 0.8069444444444445 | 0 |
| 0.8076388888888889 | 0 |
| 0.8083333333333332 | 0 |
| 0.8090277777777778 | 0 |
| 0.8097222222222222 | 0 |
| 0.8104166666666667 | 0 |
| 0.811111111111111 | 0 |
| 0.8118055555555556 | 0 |
| 0.8125 | 0 |
| 0.8131944444444444 | 0 |
| 0.813888888888889 | 0 |
| 0.8145833333333333 | 0 |
| 0.8152777777777778 | 0 |
| 0.8159722222222222 | 0 |
| 0.8166666666666668 | 0 |
| 0.8173611111111111 | 0 |
| 0.8180555555555555 | 0 |
| 0.81875 | 0 |
| 0.8194444444444445 | 0 |
| 0.8201388888888889 | 0 |
| 0.8208333333333333 | 0 |
| 0.8215277777777777 | 0 |
| 0.8222222222222223 | 0 |
| 0.8229166666666666 | 0 |
| 0.8236111111111111 | 0 |
| 0.8243055555555556 | 0 |
| 0.8250000000000001 | 0 |
| 0.8256944444444444 | 0 |
| 0.8263888888888888 | 0 |
| 0.8270833333333334 | 0 |
| 0.8277777777777778 | 0 |
| 0.8284722222222222 | 0 |
| 0.8291666666666666 | 0 |
| 0.8298611111111112 | 0 |
| 0.8305555555555556 | 0 |
| 0.8312499999999999 | 0 |
| 0.8319444444444444 | 0 |
| 0.8326388888888889 | 0 |
| 0.8333333333333334 | 0 |
| 0.8340277777777777 | 0 |
| 0.8347222222222223 | 0 |
| 0.8354166666666667 | 0 |
| 0.8361111111111111 | 0 |
| 0.8368055555555555 | 0 |
| 0.8375 | 0 |
| 0.8381944444444445 | 0 |
| 0.8388888888888889 | 0 |
| 0.8395833333333332 | 0 |
| 0.8402777777777778 | 0 |
| 0.8409722222222222 | 0 |
| 0.8416666666666667 | 0 |
| 0.842361111111111 | 0 |
| 0.8430555555555556 | 0 |
| 0.84375 | 0 |
| 0.8444444444444444 | 0 |
| 0.845138888888889 | 0 |
| 0.8458333333333333 | 0 |
| 0.8465277777777778 | 0 |
| 0.8472222222222222 | 0 |
| 0.8479166666666668 | 0 |
| 0.8486111111111111 | 0 |
| 0.8493055555555555 | 0 |
| 0.85 | 0 |
| 0.8506944444444445 | 0 |
| 0.8513888888888889 | 0 |
| 0.8520833333333333 | 0 |
| 0.8527777777777777 | 0 |
| 0.8534722222222223 | 0 |
| 0.8541666666666666 | 0 |
| 0.8548611111111111 | 0 |
| 0.8555555555555556 | 0 |
| 0.8562500000000001 | 0 |
| 0.8569444444444444 | 0 |
| 0.8576388888888888 | 0 |
| 0.8583333333333334 | 0 |
| 0.8590277777777778 | 0 |
| 0.8597222222222222 | 0 |
| 0.8604166666666666 | 0 |
| 0.8611111111111112 | 0 |
| 0.8618055555555556 | 0 |
| 0.8624999999999999 | 0 |
| 0.8631944444444444 | 0 |
| 0.8638888888888889 | 0 |
| 0.8645833333333334 | 0 |
| 0.8652777777777777 | 0 |
| 0.8659722222222223 | 0 |
| 0.8666666666666667 | 0 |
| 0.8673611111111111 | 0 |
| 0.8680555555555555 | 0 |
| 0.86875 | 0 |
| 0.8694444444444445 | 0 |
| 0.8701388888888889 | 0 |
| 0.8708333333333332 | 0 |
| 0.8715277777777778 | 0 |
| 0.8722222222222222 | 0 |
| 0.8729166666666667 | 0 |
| 0.873611111111111 | 0 |
| 0.8743055555555556 | 0 |
| 0.875 | 0 |
| 0.8756944444444444 | 0 |
| 0.876388888888889 | 0 |
| 0.8770833333333333 | 0 |
| 0.8777777777777778 | 0 |
| 0.8784722222222222 | 0 |
| 0.8791666666666668 | 0 |
| 0.8798611111111111 | 0 |
| 0.8805555555555555 | 0 |
| 0.88125 | 0 |
| 0.8819444444444445 | 0 |
| 0.8826388888888889 | 0 |
| 0.8833333333333333 | 0 |
| 0.8840277777777777 | 0 |
| 0.8847222222222223 | 0 |
| 0.8854166666666666 | 0 |
| 0.8861111111111111 | 0 |
| 0.8868055555555556 | 0 |
| 0.8875000000000001 | 0 |
| 0.8881944444444444 | 0 |
| 0.8888888888888888 | 0 |
| 0.8895833333333334 | 0 |
| 0.8902777777777778 | 0 |
| 0.8909722222222222 | 0 |
| 0.8916666666666666 | 0 |
| 0.8923611111111112 | 0 |
| 0.8930555555555556 | 0 |
| 0.8937499999999999 | 0 |
| 0.8944444444444444 | 0 |
| 0.8951388888888889 | 0 |
| 0.8958333333333334 | 0 |
| 0.8965277777777777 | 0 |
| 0.8972222222222223 | 0 |
| 0.8979166666666667 | 0 |
| 0.8986111111111111 | 0 |
| 0.8993055555555555 | 0 |
| 0.9 | 0 |
| 0.9006944444444445 | 0 |
| 0.9013888888888889 | 0 |
| 0.9020833333333332 | 0 |
| 0.9027777777777778 | 0 |
| 0.9034722222222222 | 0 |
| 0.9041666666666667 | 0 |
| 0.904861111111111 | 0 |
| 0.9055555555555556 | 0 |
| 0.90625 | 0 |
| 0.9069444444444444 | 0 |
| 0.907638888888889 | 0 |
| 0.9083333333333333 | 0 |
| 0.9090277777777778 | 0 |
| 0.9097222222222222 | 0 |
| 0.9104166666666668 | 0 |
| 0.9111111111111111 | 0 |
| 0.9118055555555555 | 0 |
| 0.9125 | 0 |
| 0.9131944444444445 | 0 |
| 0.9138888888888889 | 0 |
| 0.9145833333333333 | 0 |
| 0.9152777777777777 | 0 |
| 0.9159722222222223 | 0 |
| 0.9166666666666666 | 0 |
| 0.9173611111111111 | 0 |
| 0.9180555555555556 | 0 |
| 0.9187500000000001 | 0 |
| 0.9194444444444444 | 0 |
| 0.9201388888888888 | 0 |
| 0.9208333333333334 | 0 |
| 0.9215277777777778 | 0 |
| 0.9222222222222222 | 0 |
| 0.9229166666666666 | 0 |
| 0.9236111111111112 | 0 |
| 0.9243055555555556 | 0 |
| 0.9249999999999999 | 0 |
| 0.9256944444444444 | 0 |
| 0.9263888888888889 | 0 |
| 0.9270833333333334 | 0 |
| 0.9277777777777777 | 0 |
| 0.9284722222222223 | 0 |
| 0.9291666666666667 | 0 |
| 0.9298611111111111 | 0 |
| 0.9305555555555555 | 0 |
| 0.93125 | 0 |
| 0.9319444444444445 | 0 |
| 0.9326388888888889 | 0 |
| 0.9333333333333332 | 0 |
| 0.9340277777777778 | 0 |
| 0.9347222222222222 | 0 |
| 0.9354166666666667 | 0 |
| 0.936111111111111 | 0 |
| 0.9368055555555556 | 0 |
| 0.9375 | 0 |
| 0.9381944444444444 | 0 |
| 0.938888888888889 | 0 |
| 0.9395833333333333 | 0 |
| 0.9402777777777778 | 0 |
| 0.9409722222222222 | 0 |
| 0.9416666666666668 | 0 |
| 0.9423611111111111 | 0 |
| 0.9430555555555555 | 0 |
| 0.94375 | 0 |
| 0.9444444444444445 | 0 |
| 0.9451388888888889 | 0 |
| 0.9458333333333333 | 0 |
| 0.9465277777777777 | 0 |
| 0.9472222222222223 | 0 |
| 0.9479166666666666 | 0 |
| 0.9486111111111111 | 0 |
| 0.9493055555555556 | 0 |
| 0.9500000000000001 | 0 |
| 0.9506944444444444 | 0 |
| 0.9513888888888888 | 0 |
| 0.9520833333333334 | 0 |
| 0.9527777777777778 | 0 |
| 0.9534722222222222 | 0 |
| 0.9541666666666666 | 0 |
| 0.9548611111111112 | 0 |
| 0.9555555555555556 | 0 |
| 0.9562499999999999 | 0 |
| 0.9569444444444444 | 0 |
| 0.9576388888888889 | 0 |
| 0.9583333333333334 | 0 |
| 0.9590277777777777 | 0 |
| 0.9597222222222223 | 0 |
| 0.9604166666666667 | 0 |
| 0.9611111111111111 | 0 |
| 0.9618055555555555 | 0 |
| 0.9625 | 0 |
| 0.9631944444444445 | 0 |
| 0.9638888888888889 | 0 |
| 0.9645833333333332 | 0 |
| 0.9652777777777778 | 0 |
| 0.9659722222222222 | 0 |
| 0.9666666666666667 | 0 |
| 0.967361111111111 | 0 |
| 0.9680555555555556 | 0 |
| 0.96875 | 0 |
| 0.9694444444444444 | 0 |
| 0.970138888888889 | 0 |
| 0.9708333333333333 | 0 |
| 0.9715277777777778 | 0 |
| 0.9722222222222222 | 0 |
| 0.9729166666666668 | 0 |
| 0.9736111111111111 | 0 |
| 0.9743055555555555 | 0 |
| 0.975 | 0 |
| 0.9756944444444445 | 0 |
| 0.9763888888888889 | 0 |
| 0.9770833333333333 | 0 |
| 0.9777777777777777 | 0 |
| 0.9784722222222223 | 0 |
| 0.9791666666666666 | 0 |
| 0.9798611111111111 | 0 |
| 0.9805555555555556 | 0 |
| 0.9812500000000001 | 0 |
| 0.9819444444444444 | 0 |
| 0.9826388888888888 | 0 |
| 0.9833333333333334 | 0 |
| 0.9840277777777778 | 0 |
| 0.9847222222222222 | 0 |
| 0.9854166666666666 | 0 |
| 0.9861111111111112 | 0 |
| 0.9868055555555556 | 0 |
| 0.9874999999999999 | 0 |
| 0.9881944444444444 | 0 |
| 0.9888888888888889 | 0 |
| 0.9895833333333334 | 0 |
| 0.9902777777777777 | 0 |
| 0.9909722222222223 | 0 |
| 0.9916666666666667 | 0 |
| 0.9923611111111111 | 0 |
| 0.9930555555555555 | 0 |
| 0.99375 | 0 |
| 0.9944444444444445 | 0 |
| 0.9951388888888889 | 0 |
| 0.9958333333333332 | 0 |
| 0.9965277777777778 | 0 |
| 0.9972222222222222 | 0 |
| 0.9979166666666667 | 0 |
| 0.998611111111111 | 0 |
| 0.9993055555555556 | 0 |